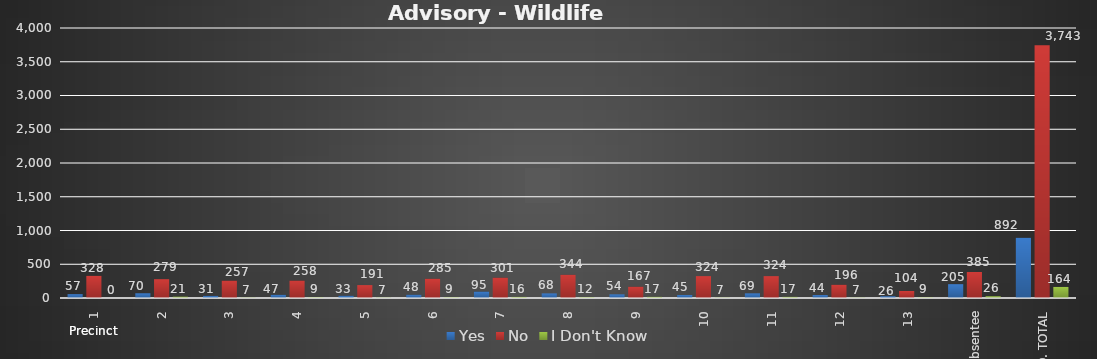
| Category | Yes | No | I Don't Know |
|---|---|---|---|
| 1 | 57 | 328 | 0 |
| 2 | 70 | 279 | 21 |
| 3 | 31 | 257 | 7 |
| 4 | 47 | 258 | 9 |
| 5 | 33 | 191 | 7 |
| 6 | 48 | 285 | 9 |
| 7 | 95 | 301 | 16 |
| 8 | 68 | 344 | 12 |
| 9 | 54 | 167 | 17 |
| 10 | 45 | 324 | 7 |
| 11 | 69 | 324 | 17 |
| 12 | 44 | 196 | 7 |
| 13 | 26 | 104 | 9 |
| Absentee | 205 | 385 | 26 |
| CO. TOTAL | 892 | 3743 | 164 |